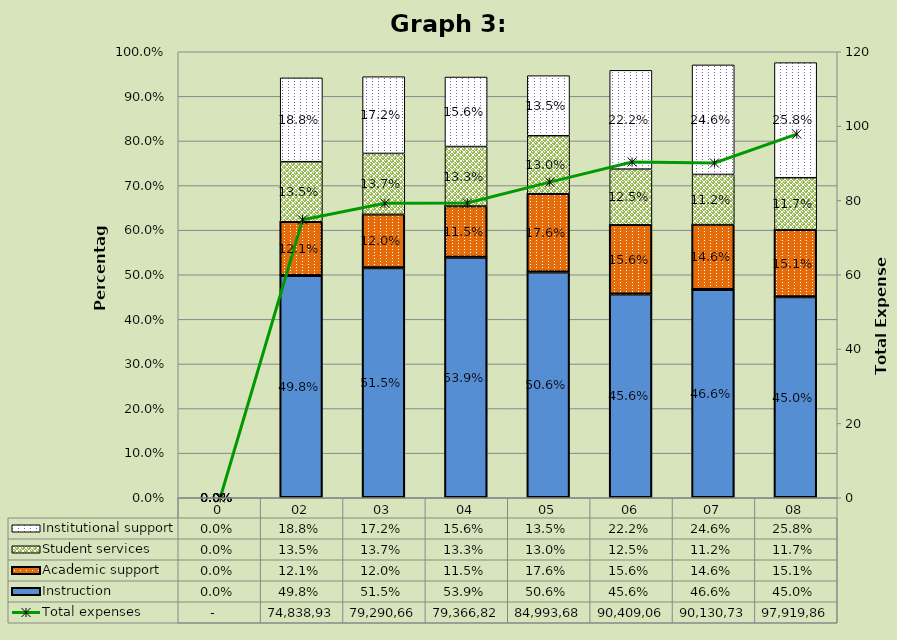
| Category | Instruction | Academic support | Student services | Institutional support |
|---|---|---|---|---|
| 0 | 0 | 0 | 0 | 0 |
| 02 | 0.498 | 0.121 | 0.135 | 0.188 |
| 03 | 0.515 | 0.12 | 0.137 | 0.172 |
| 04 | 0.539 | 0.115 | 0.133 | 0.156 |
| 05 | 0.506 | 0.176 | 0.13 | 0.135 |
| 06 | 0.456 | 0.156 | 0.125 | 0.222 |
| 07 | 0.466 | 0.146 | 0.112 | 0.246 |
| 08 | 0.45 | 0.151 | 0.117 | 0.258 |